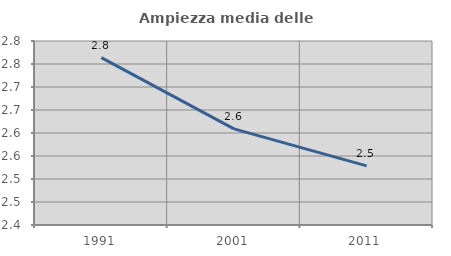
| Category | Ampiezza media delle famiglie |
|---|---|
| 1991.0 | 2.764 |
| 2001.0 | 2.609 |
| 2011.0 | 2.528 |